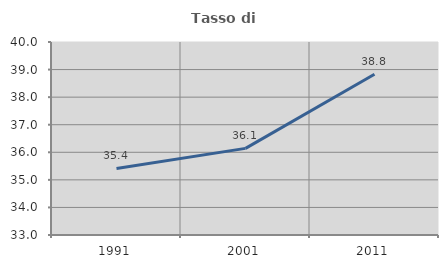
| Category | Tasso di occupazione   |
|---|---|
| 1991.0 | 35.412 |
| 2001.0 | 36.142 |
| 2011.0 | 38.829 |